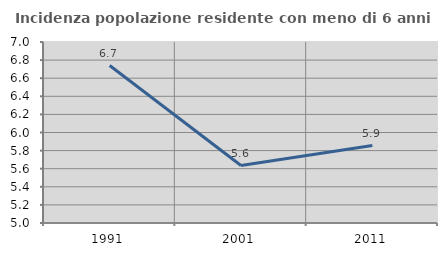
| Category | Incidenza popolazione residente con meno di 6 anni |
|---|---|
| 1991.0 | 6.74 |
| 2001.0 | 5.635 |
| 2011.0 | 5.856 |